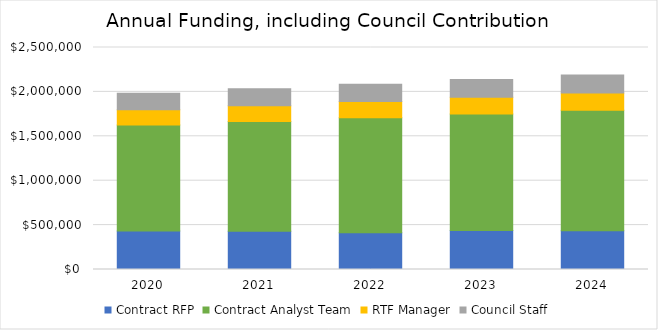
| Category | Contract RFP | Contract Analyst Team | RTF Manager | Council Staff |
|---|---|---|---|---|
| 2020.0 | 433000 | 1193000 | 174000 | 185600 |
| 2021.0 | 431400 | 1235200 | 178400 | 190300 |
| 2022.0 | 412900 | 1295400 | 182800 | 195000 |
| 2023.0 | 440400 | 1310600 | 187400 | 199900 |
| 2024.0 | 436000 | 1358700 | 192100 | 204900 |